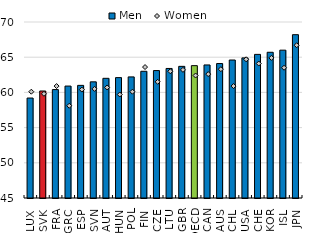
| Category | Men |
|---|---|
| LUX | 59.2 |
| SVK | 60.2 |
| FRA | 60.4 |
| GRC | 60.9 |
| ESP | 61 |
| SVN | 61.5 |
| AUT | 62 |
| HUN | 62.1 |
| POL | 62.2 |
| FIN | 63 |
| CZE | 63.1 |
| LTU | 63.4 |
| GBR | 63.7 |
| OECD | 63.8 |
| CAN | 63.9 |
| AUS | 64.1 |
| CHL | 64.6 |
| USA | 64.9 |
| CHE | 65.4 |
| KOR | 65.7 |
| ISL | 66 |
| JPN | 68.2 |